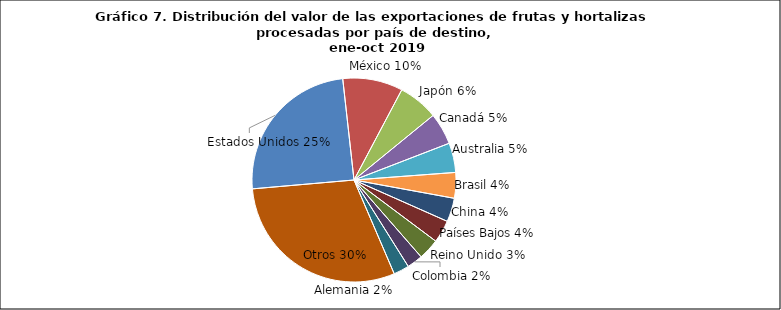
| Category | Series 0 |
|---|---|
| Estados Unidos | 307974053.22 |
| México | 119083465.44 |
| Japón | 79414207.15 |
| Canadá | 62986537.38 |
| Australia | 58433689.59 |
| Brasil | 50828890.41 |
| China | 47085232.73 |
| Países Bajos | 44856285.43 |
| Reino Unido | 41904933.5 |
| Colombia | 31248642.57 |
| Alemania | 30954518.75 |
| Otros | 375987725.11 |